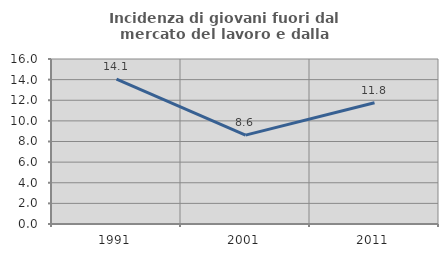
| Category | Incidenza di giovani fuori dal mercato del lavoro e dalla formazione  |
|---|---|
| 1991.0 | 14.056 |
| 2001.0 | 8.621 |
| 2011.0 | 11.765 |